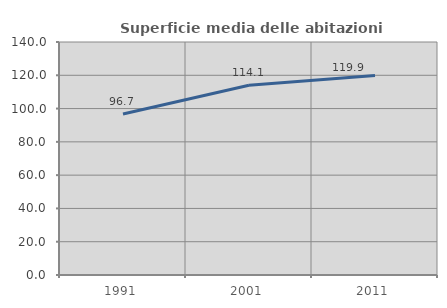
| Category | Superficie media delle abitazioni occupate |
|---|---|
| 1991.0 | 96.704 |
| 2001.0 | 114.053 |
| 2011.0 | 119.92 |